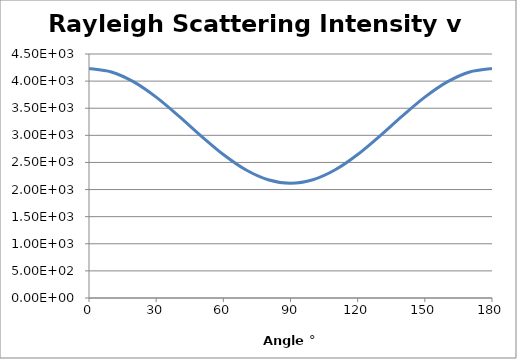
| Category | Scattering Intensity |
|---|---|
| 0.0 | 4232.984 |
| 10.0 | 4169.164 |
| 20.0 | 3985.401 |
| 30.0 | 3703.861 |
| 40.0 | 3358.5 |
| 50.0 | 2990.975 |
| 60.0 | 2645.615 |
| 70.0 | 2364.074 |
| 80.0 | 2180.312 |
| 90.0 | 2116.492 |
| 100.0 | 2180.312 |
| 110.0 | 2364.074 |
| 120.0 | 2645.615 |
| 130.0 | 2990.975 |
| 140.0 | 3358.5 |
| 150.0 | 3703.861 |
| 160.0 | 3985.401 |
| 170.0 | 4169.164 |
| 180.0 | 4232.984 |